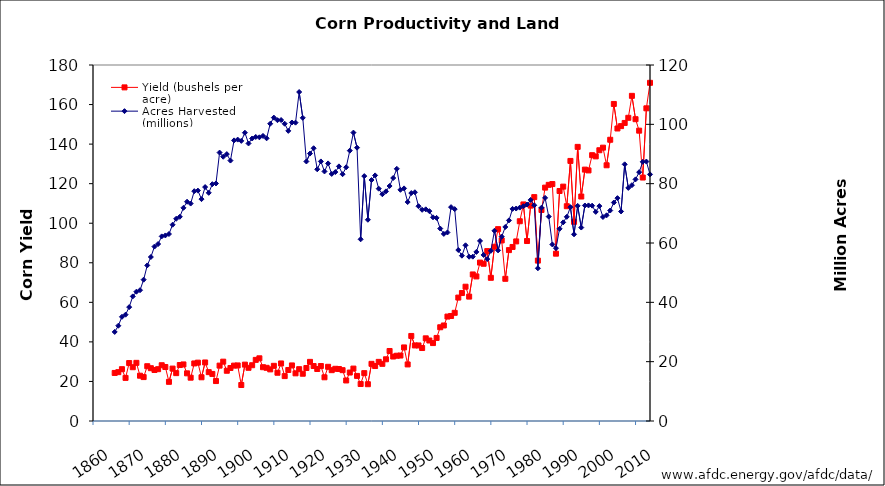
| Category | Yield (bushels per acre) |
|---|---|
| 1866.0 | 24.3 |
| 1867.0 | 24.7 |
| 1868.0 | 26.2 |
| 1869.0 | 21.8 |
| 1870.0 | 29.3 |
| 1871.0 | 27.2 |
| 1872.0 | 29.4 |
| 1873.0 | 22.9 |
| 1874.0 | 22.2 |
| 1875.0 | 27.7 |
| 1876.0 | 26.7 |
| 1877.0 | 25.8 |
| 1878.0 | 26.2 |
| 1879.0 | 28.2 |
| 1880.0 | 27.3 |
| 1881.0 | 19.8 |
| 1882.0 | 26.5 |
| 1883.0 | 24.2 |
| 1884.0 | 28.3 |
| 1885.0 | 28.6 |
| 1886.0 | 24.1 |
| 1887.0 | 21.9 |
| 1888.0 | 29.1 |
| 1889.0 | 29.5 |
| 1890.0 | 22.1 |
| 1891.0 | 29.6 |
| 1892.0 | 24.7 |
| 1893.0 | 23.8 |
| 1894.0 | 20.2 |
| 1895.0 | 28 |
| 1896.0 | 30 |
| 1897.0 | 25.4 |
| 1898.0 | 26.8 |
| 1899.0 | 28 |
| 1900.0 | 28.1 |
| 1901.0 | 18.2 |
| 1902.0 | 28.5 |
| 1903.0 | 26.9 |
| 1904.0 | 28.2 |
| 1905.0 | 30.9 |
| 1906.0 | 31.7 |
| 1907.0 | 27.2 |
| 1908.0 | 26.9 |
| 1909.0 | 26.1 |
| 1910.0 | 27.9 |
| 1911.0 | 24.4 |
| 1912.0 | 29.1 |
| 1913.0 | 22.7 |
| 1914.0 | 25.8 |
| 1915.0 | 28.1 |
| 1916.0 | 24.1 |
| 1917.0 | 26.2 |
| 1918.0 | 23.9 |
| 1919.0 | 26.8 |
| 1920.0 | 29.9 |
| 1921.0 | 27.8 |
| 1922.0 | 26.3 |
| 1923.0 | 27.8 |
| 1924.0 | 22.1 |
| 1925.0 | 27.4 |
| 1926.0 | 25.7 |
| 1927.0 | 26.4 |
| 1928.0 | 26.3 |
| 1929.0 | 25.7 |
| 1930.0 | 20.5 |
| 1931.0 | 24.5 |
| 1932.0 | 26.5 |
| 1933.0 | 22.8 |
| 1934.0 | 18.7 |
| 1935.0 | 24.2 |
| 1936.0 | 18.6 |
| 1937.0 | 28.9 |
| 1938.0 | 27.8 |
| 1939.0 | 29.9 |
| 1940.0 | 28.9 |
| 1941.0 | 31.2 |
| 1942.0 | 35.4 |
| 1943.0 | 32.6 |
| 1944.0 | 33 |
| 1945.0 | 33.1 |
| 1946.0 | 37.2 |
| 1947.0 | 28.6 |
| 1948.0 | 43 |
| 1949.0 | 38.2 |
| 1950.0 | 38.2 |
| 1951.0 | 36.9 |
| 1952.0 | 41.8 |
| 1953.0 | 40.7 |
| 1954.0 | 39.4 |
| 1955.0 | 42 |
| 1956.0 | 47.4 |
| 1957.0 | 48.3 |
| 1958.0 | 52.8 |
| 1959.0 | 53.1 |
| 1960.0 | 54.7 |
| 1961.0 | 62.4 |
| 1962.0 | 64.7 |
| 1963.0 | 67.9 |
| 1964.0 | 62.9 |
| 1965.0 | 74.1 |
| 1966.0 | 73.1 |
| 1967.0 | 80.1 |
| 1968.0 | 79.5 |
| 1969.0 | 85.9 |
| 1970.0 | 72.4 |
| 1971.0 | 88.1 |
| 1972.0 | 97 |
| 1973.0 | 91.3 |
| 1974.0 | 71.9 |
| 1975.0 | 86.4 |
| 1976.0 | 88 |
| 1977.0 | 90.8 |
| 1978.0 | 101 |
| 1979.0 | 109.5 |
| 1980.0 | 91 |
| 1981.0 | 108.9 |
| 1982.0 | 113.2 |
| 1983.0 | 81.1 |
| 1984.0 | 106.7 |
| 1985.0 | 118 |
| 1986.0 | 119.4 |
| 1987.0 | 119.8 |
| 1988.0 | 84.6 |
| 1989.0 | 116.3 |
| 1990.0 | 118.5 |
| 1991.0 | 108.6 |
| 1992.0 | 131.5 |
| 1993.0 | 100.7 |
| 1994.0 | 138.6 |
| 1995.0 | 113.5 |
| 1996.0 | 127.1 |
| 1997.0 | 126.7 |
| 1998.0 | 134.4 |
| 1999.0 | 133.8 |
| 2000.0 | 136.9 |
| 2001.0 | 138.2 |
| 2002.0 | 129.3 |
| 2003.0 | 142.2 |
| 2004.0 | 160.3 |
| 2005.0 | 147.9 |
| 2006.0 | 149.1 |
| 2007.0 | 150.7 |
| 2008.0 | 153.3 |
| 2009.0 | 164.4 |
| 2010.0 | 152.6 |
| 2011.0 | 146.8 |
| 2012.0 | 123.1 |
| 2013.0 | 158.1 |
| 2014.0 | 170.991 |